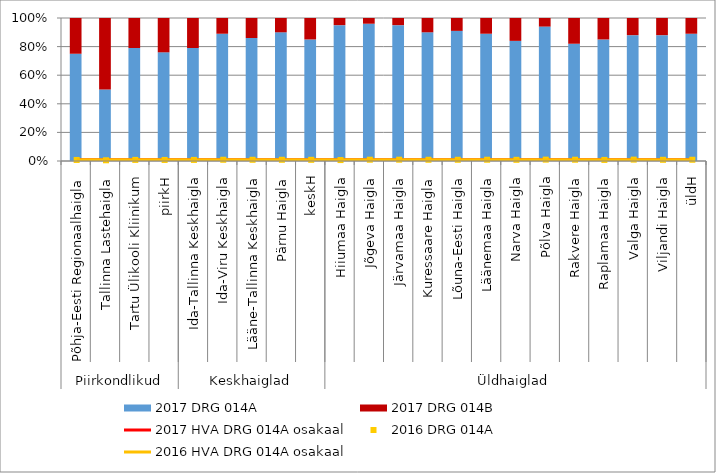
| Category | 2017 DRG 014A | 2017 DRG 014B |
|---|---|---|
| 0 | 0.75 | 0.25 |
| 1 | 0.5 | 0.5 |
| 2 | 0.79 | 0.21 |
| 3 | 0.76 | 0.24 |
| 4 | 0.79 | 0.21 |
| 5 | 0.89 | 0.11 |
| 6 | 0.86 | 0.14 |
| 7 | 0.9 | 0.1 |
| 8 | 0.85 | 0.15 |
| 9 | 0.95 | 0.05 |
| 10 | 0.96 | 0.04 |
| 11 | 0.95 | 0.05 |
| 12 | 0.9 | 0.1 |
| 13 | 0.91 | 0.09 |
| 14 | 0.89 | 0.11 |
| 15 | 0.84 | 0.16 |
| 16 | 0.94 | 0.06 |
| 17 | 0.82 | 0.18 |
| 18 | 0.85 | 0.15 |
| 19 | 0.88 | 0.12 |
| 20 | 0.88 | 0.12 |
| 21 | 0.89 | 0.11 |